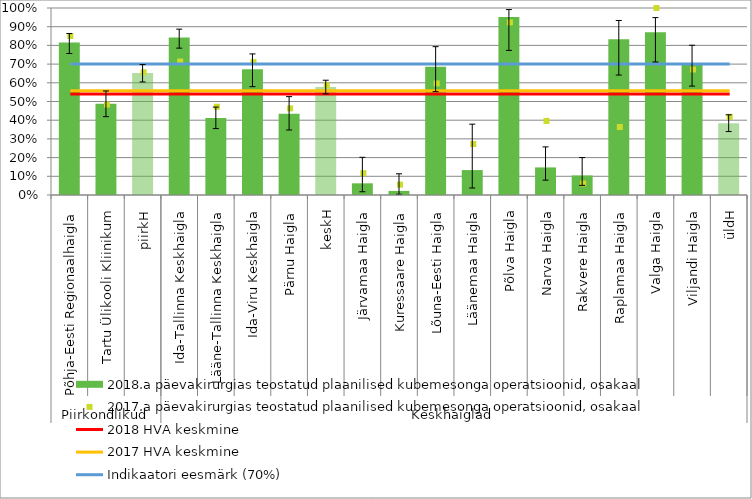
| Category | 2018.a päevakirurgias teostatud plaanilised kubemesonga operatsioonid, osakaal |
|---|---|
| 0 | 0.816 |
| 1 | 0.487 |
| 2 | 0.652 |
| 3 | 0.843 |
| 4 | 0.412 |
| 5 | 0.673 |
| 6 | 0.435 |
| 7 | 0.578 |
| 8 | 0.062 |
| 9 | 0.022 |
| 10 | 0.685 |
| 11 | 0.133 |
| 12 | 0.952 |
| 13 | 0.148 |
| 14 | 0.104 |
| 15 | 0.833 |
| 16 | 0.871 |
| 17 | 0.703 |
| 18 | 0.383 |